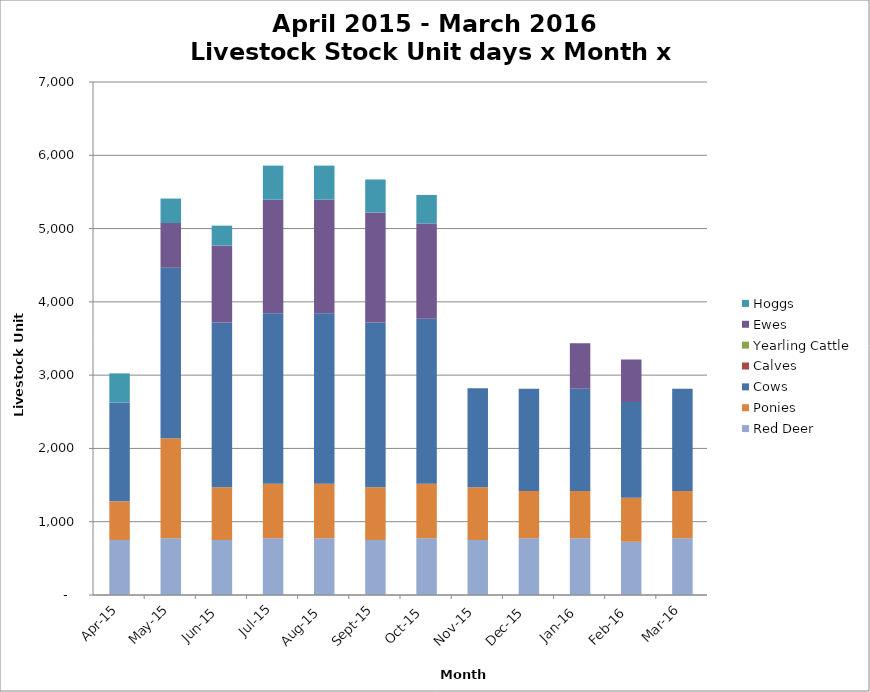
| Category | Red Deer | Ponies | Cows | Calves | Yearling Cattle | Ewes | Hoggs |
|---|---|---|---|---|---|---|---|
| 2015-04-01 | 750 | 528 | 1350 | 0 | 0 | 0 | 396 |
| 2015-05-01 | 775 | 1364 | 2325 | 0 | 0 | 610.7 | 334.8 |
| 2015-06-01 | 750 | 720 | 2250 | 0 | 0 | 1050 | 270 |
| 2015-07-01 | 775 | 744 | 2325 | 0 | 0 | 1550 | 465 |
| 2015-08-01 | 775 | 744 | 2325 | 0 | 0 | 1550 | 465 |
| 2015-09-01 | 750 | 720 | 2250 | 0 | 0 | 1500 | 450 |
| 2015-10-01 | 775 | 744 | 2250 | 0 | 0 | 1300 | 390 |
| 2015-11-01 | 750 | 720 | 1350 | 0 | 0 | 0 | 0 |
| 2015-12-01 | 775 | 644.8 | 1395 | 0 | 0 | 0 | 0 |
| 2016-01-01 | 775 | 644.8 | 1395 | 0 | 0 | 620 | 0 |
| 2016-02-01 | 725 | 603.2 | 1305 | 0 | 0 | 580 | 0 |
| 2016-03-01 | 775 | 644.8 | 1395 | 0 | 0 | 0 | 0 |